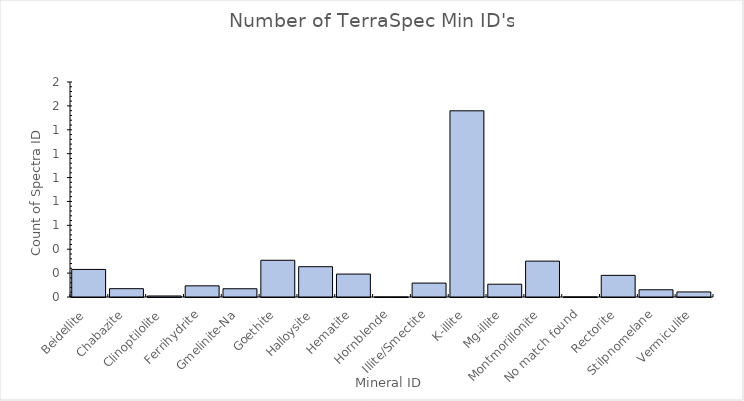
| Category | Total |
|---|---|
| Beidellite | 0.231 |
| Chabazite | 0.07 |
| Clinoptilolite | 0.009 |
| Ferrihydrite | 0.093 |
| Gmelinite-Na | 0.069 |
| Goethite | 0.307 |
| Halloysite | 0.254 |
| Hematite | 0.192 |
| Hornblende | 0 |
| Illite/Smectite | 0.116 |
| K-illite | 1.559 |
| Mg-illite | 0.107 |
| Montmorillonite | 0.3 |
| No match found | 0.001 |
| Rectorite | 0.181 |
| Stilpnomelane | 0.06 |
| Vermiculite | 0.043 |